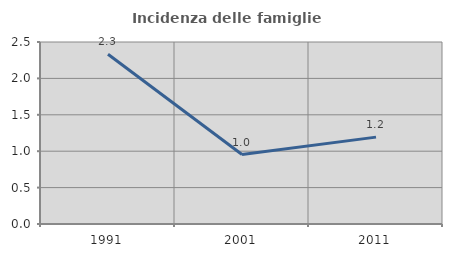
| Category | Incidenza delle famiglie numerose |
|---|---|
| 1991.0 | 2.332 |
| 2001.0 | 0.955 |
| 2011.0 | 1.193 |